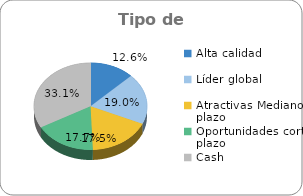
| Category | Series 0 |
|---|---|
| Alta calidad | 0.126 |
| Líder global | 0.19 |
| Atractivas Mediano plazo | 0.177 |
| Oportunidades corto plazo | 0.175 |
| Cash | 0.331 |